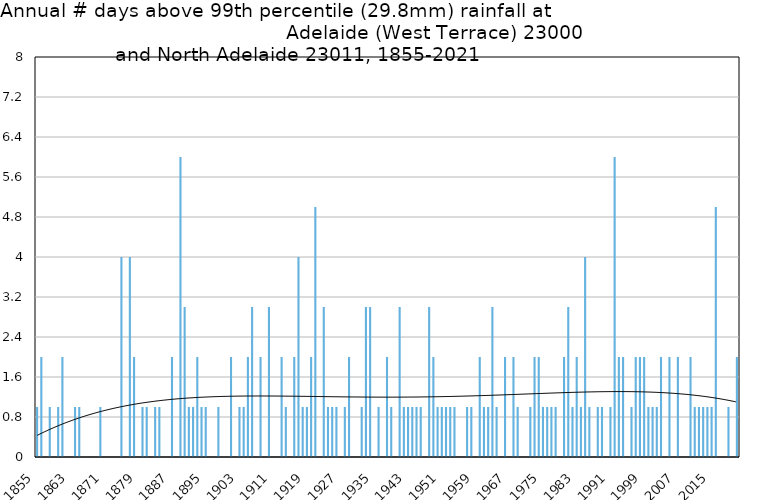
| Category | Annual # days above 99th percentile |
|---|---|
| 1855 | 1 |
| 1856 | 2 |
| 1857 | 0 |
| 1858 | 1 |
| 1859 | 0 |
| 1860 | 1 |
| 1861 | 2 |
| 1862 | 0 |
| 1863 | 0 |
| 1864 | 1 |
| 1865 | 1 |
| 1866 | 0 |
| 1867 | 0 |
| 1868 | 0 |
| 1869 | 0 |
| 1870 | 1 |
| 1871 | 0 |
| 1872 | 0 |
| 1873 | 0 |
| 1874 | 0 |
| 1875 | 4 |
| 1876 | 0 |
| 1877 | 4 |
| 1878 | 2 |
| 1879 | 0 |
| 1880 | 1 |
| 1881 | 1 |
| 1882 | 0 |
| 1883 | 1 |
| 1884 | 1 |
| 1885 | 0 |
| 1886 | 0 |
| 1887 | 2 |
| 1888 | 0 |
| 1889 | 6 |
| 1890 | 3 |
| 1891 | 1 |
| 1892 | 1 |
| 1893 | 2 |
| 1894 | 1 |
| 1895 | 1 |
| 1896 | 0 |
| 1897 | 0 |
| 1898 | 1 |
| 1899 | 0 |
| 1900 | 0 |
| 1901 | 2 |
| 1902 | 0 |
| 1903 | 1 |
| 1904 | 1 |
| 1905 | 2 |
| 1906 | 3 |
| 1907 | 0 |
| 1908 | 2 |
| 1909 | 0 |
| 1910 | 3 |
| 1911 | 0 |
| 1912 | 0 |
| 1913 | 2 |
| 1914 | 1 |
| 1915 | 0 |
| 1916 | 2 |
| 1917 | 4 |
| 1918 | 1 |
| 1919 | 1 |
| 1920 | 2 |
| 1921 | 5 |
| 1922 | 0 |
| 1923 | 3 |
| 1924 | 1 |
| 1925 | 1 |
| 1926 | 1 |
| 1927 | 0 |
| 1928 | 1 |
| 1929 | 2 |
| 1930 | 0 |
| 1931 | 0 |
| 1932 | 1 |
| 1933 | 3 |
| 1934 | 3 |
| 1935 | 0 |
| 1936 | 1 |
| 1937 | 0 |
| 1938 | 2 |
| 1939 | 1 |
| 1940 | 0 |
| 1941 | 3 |
| 1942 | 1 |
| 1943 | 1 |
| 1944 | 1 |
| 1945 | 1 |
| 1946 | 1 |
| 1947 | 0 |
| 1948 | 3 |
| 1949 | 2 |
| 1950 | 1 |
| 1951 | 1 |
| 1952 | 1 |
| 1953 | 1 |
| 1954 | 1 |
| 1955 | 0 |
| 1956 | 0 |
| 1957 | 1 |
| 1958 | 1 |
| 1959 | 0 |
| 1960 | 2 |
| 1961 | 1 |
| 1962 | 1 |
| 1963 | 3 |
| 1964 | 1 |
| 1965 | 0 |
| 1966 | 2 |
| 1967 | 0 |
| 1968 | 2 |
| 1969 | 1 |
| 1970 | 0 |
| 1971 | 0 |
| 1972 | 1 |
| 1973 | 2 |
| 1974 | 2 |
| 1975 | 1 |
| 1976 | 1 |
| 1977 | 1 |
| 1978 | 1 |
| 1979 | 0 |
| 1980 | 2 |
| 1981 | 3 |
| 1982 | 1 |
| 1983 | 2 |
| 1984 | 1 |
| 1985 | 4 |
| 1986 | 1 |
| 1987 | 0 |
| 1988 | 1 |
| 1989 | 1 |
| 1990 | 0 |
| 1991 | 1 |
| 1992 | 6 |
| 1993 | 2 |
| 1994 | 2 |
| 1995 | 0 |
| 1996 | 1 |
| 1997 | 2 |
| 1998 | 2 |
| 1999 | 2 |
| 2000 | 1 |
| 2001 | 1 |
| 2002 | 1 |
| 2003 | 2 |
| 2004 | 0 |
| 2005 | 2 |
| 2006 | 0 |
| 2007 | 2 |
| 2008 | 0 |
| 2009 | 0 |
| 2010 | 2 |
| 2011 | 1 |
| 2012 | 1 |
| 2013 | 1 |
| 2014 | 1 |
| 2015 | 1 |
| 2016 | 5 |
| 2017 | 0 |
| 2018 | 0 |
| 2019 | 1 |
| 2020 | 0 |
| 2021 | 2 |